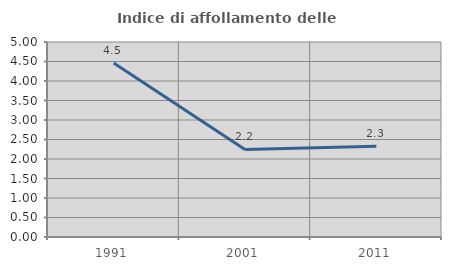
| Category | Indice di affollamento delle abitazioni  |
|---|---|
| 1991.0 | 4.464 |
| 2001.0 | 2.245 |
| 2011.0 | 2.33 |